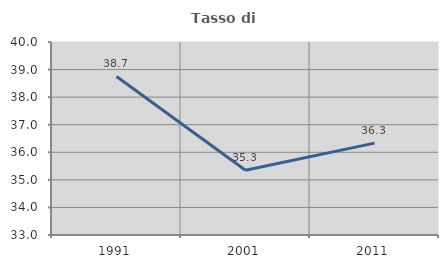
| Category | Tasso di occupazione   |
|---|---|
| 1991.0 | 38.749 |
| 2001.0 | 35.347 |
| 2011.0 | 36.332 |